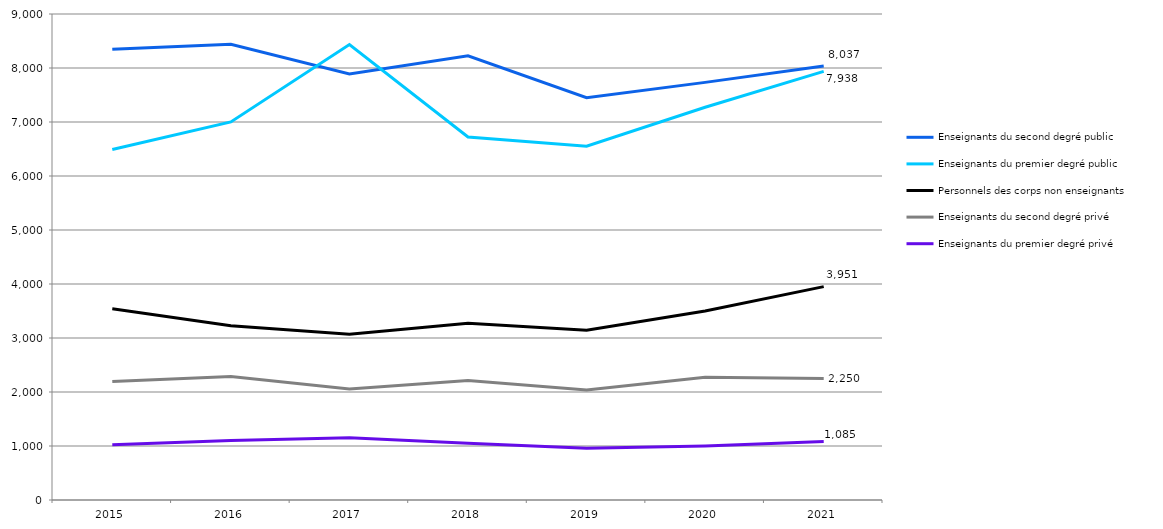
| Category | Enseignants du second degré public | Enseignants du premier degré public | Personnels des corps non enseignants  | Enseignants du second degré privé | Enseignants du premier degré privé |
|---|---|---|---|---|---|
| 2015.0 | 8345 | 6491 | 3540 | 2193 | 1022 |
| 2016.0 | 8440 | 7002 | 3228 | 2285 | 1102 |
| 2017.0 | 7891 | 8434 | 3069 | 2055 | 1155 |
| 2018.0 | 8226 | 6722 | 3273 | 2214 | 1050 |
| 2019.0 | 7449 | 6552 | 3142 | 2037 | 959 |
| 2020.0 | 7734 | 7273 | 3501 | 2271 | 1002 |
| 2021.0 | 8037 | 7938 | 3951 | 2250 | 1085 |